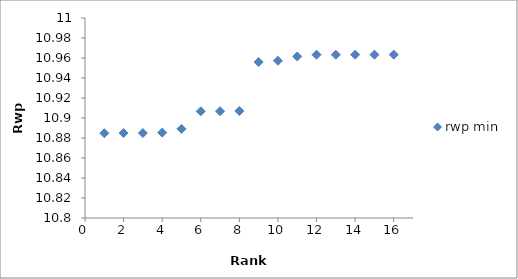
| Category | rwp min |
|---|---|
| 1.0 | 10.885 |
| 2.0 | 10.885 |
| 3.0 | 10.885 |
| 4.0 | 10.885 |
| 5.0 | 10.889 |
| 6.0 | 10.907 |
| 7.0 | 10.907 |
| 8.0 | 10.907 |
| 9.0 | 10.956 |
| 10.0 | 10.957 |
| 11.0 | 10.962 |
| 12.0 | 10.963 |
| 13.0 | 10.963 |
| 14.0 | 10.963 |
| 15.0 | 10.963 |
| 16.0 | 10.963 |
| 17.0 | 26.235 |
| 18.0 | 26.288 |
| 19.0 | 26.294 |
| 20.0 | 26.317 |
| 21.0 | 26.387 |
| 22.0 | 26.387 |
| 23.0 | 26.402 |
| 24.0 | 26.435 |
| 25.0 | 26.435 |
| 26.0 | 26.507 |
| 27.0 | 26.534 |
| 28.0 | 26.534 |
| 29.0 | 26.646 |
| 30.0 | 26.656 |
| 31.0 | 26.665 |
| 32.0 | 26.709 |
| 33.0 | 26.71 |
| 34.0 | 26.71 |
| 35.0 | 26.71 |
| 36.0 | 26.711 |
| 37.0 | 26.716 |
| 38.0 | 26.716 |
| 39.0 | 26.716 |
| 40.0 | 26.716 |
| 41.0 | 26.727 |
| 42.0 | 26.727 |
| 43.0 | 26.728 |
| 44.0 | 26.752 |
| 45.0 | 26.793 |
| 46.0 | 26.803 |
| 47.0 | 26.816 |
| 48.0 | 26.817 |
| 49.0 | 26.817 |
| 50.0 | 26.855 |
| 51.0 | 26.859 |
| 52.0 | 26.859 |
| 53.0 | 26.859 |
| 54.0 | 27.081 |
| 55.0 | 27.097 |
| 56.0 | 27.115 |
| 57.0 | 27.117 |
| 58.0 | 27.117 |
| 59.0 | 27.117 |
| 60.0 | 27.149 |
| 61.0 | 27.161 |
| 62.0 | 27.161 |
| 63.0 | 27.161 |
| 64.0 | 27.161 |
| 65.0 | 27.161 |
| 66.0 | 27.161 |
| 67.0 | 27.161 |
| 68.0 | 51.442 |
| 69.0 | 51.442 |